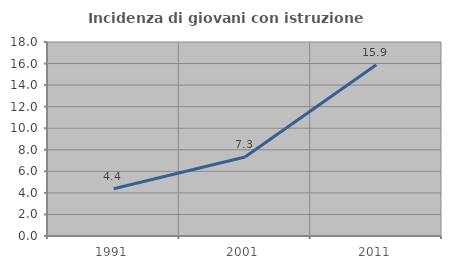
| Category | Incidenza di giovani con istruzione universitaria |
|---|---|
| 1991.0 | 4.386 |
| 2001.0 | 7.333 |
| 2011.0 | 15.888 |